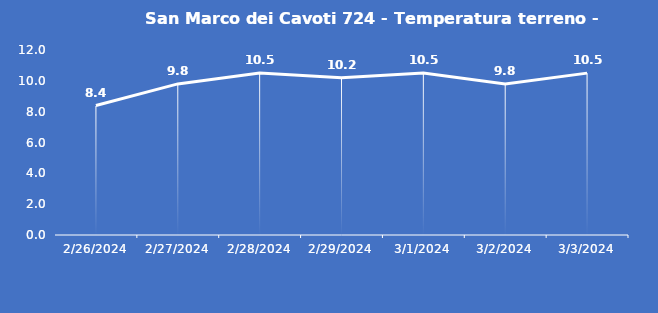
| Category | San Marco dei Cavoti 724 - Temperatura terreno - Grezzo (°C) |
|---|---|
| 2/26/24 | 8.4 |
| 2/27/24 | 9.8 |
| 2/28/24 | 10.5 |
| 2/29/24 | 10.2 |
| 3/1/24 | 10.5 |
| 3/2/24 | 9.8 |
| 3/3/24 | 10.5 |